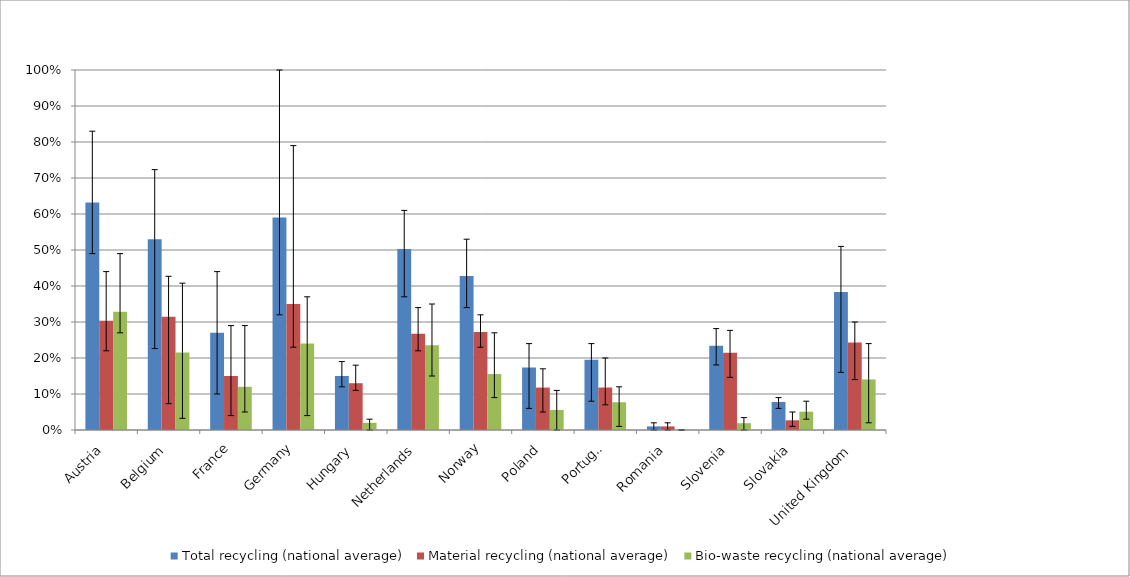
| Category | Total recycling (national average) | Material recycling (national average) | Bio-waste recycling (national average) |
|---|---|---|---|
| Austria | 0.632 | 0.303 | 0.329 |
| Belgium | 0.53 | 0.314 | 0.215 |
| France | 0.27 | 0.15 | 0.12 |
| Germany | 0.59 | 0.35 | 0.24 |
| Hungary | 0.15 | 0.13 | 0.02 |
| Netherlands | 0.503 | 0.267 | 0.236 |
| Norway | 0.428 | 0.273 | 0.155 |
| Poland | 0.174 | 0.118 | 0.056 |
| Portugal | 0.195 | 0.118 | 0.077 |
| Romania | 0.01 | 0.01 | 0 |
| Slovenia | 0.234 | 0.215 | 0.019 |
| Slovakia | 0.078 | 0.027 | 0.051 |
| United Kingdom | 0.383 | 0.243 | 0.14 |